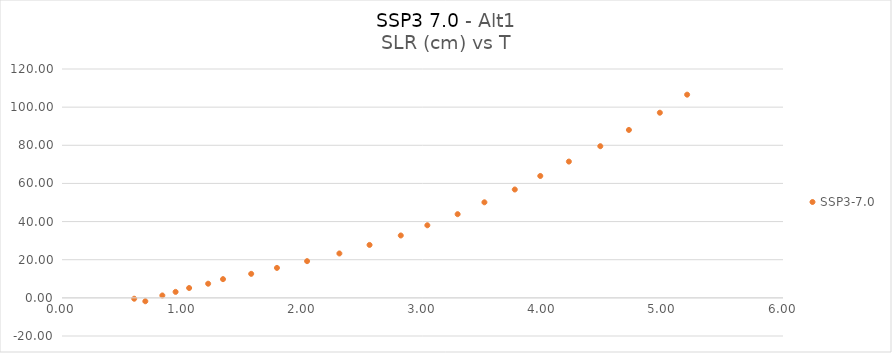
| Category | SSP3-7.0 |
|---|---|
| 0.693400617 | -1.781 |
| 0.600872844 | -0.455 |
| 0.835003234 | 1.253 |
| 0.945258389 | 3.132 |
| 1.057970477 | 5.16 |
| 1.216178519 | 7.412 |
| 1.339886213 | 9.814 |
| 1.574396823 | 12.59 |
| 1.788818287 | 15.709 |
| 2.03954175 | 19.254 |
| 2.308307497 | 23.278 |
| 2.559346346 | 27.752 |
| 2.819310823 | 32.707 |
| 3.040334272 | 38.056 |
| 3.292401005 | 43.878 |
| 3.515249209 | 50.106 |
| 3.767928803 | 56.818 |
| 3.980278791 | 63.914 |
| 4.218160448 | 71.46 |
| 4.479646462 | 79.523 |
| 4.717709217 | 88.043 |
| 4.97519555 | 97.077 |
| 5.202177783 | 106.541 |